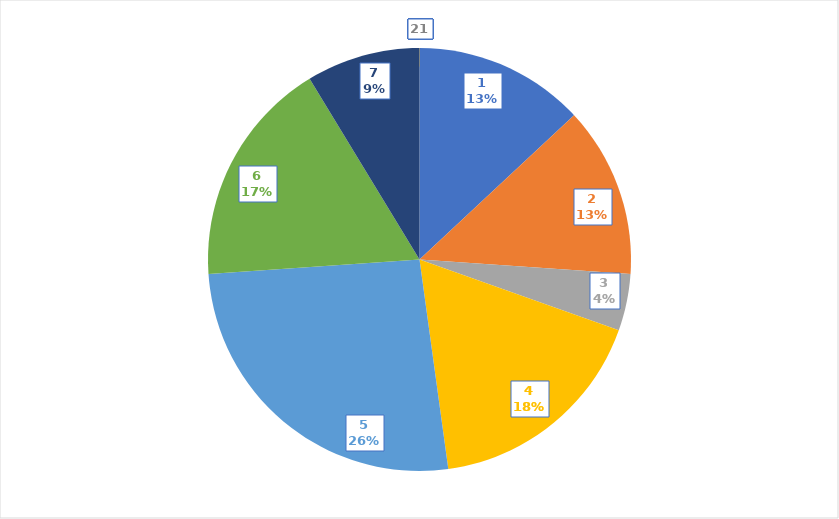
| Category | Количество |
|---|---|
| 1.0 | 3 |
| 2.0 | 3 |
| 3.0 | 1 |
| 4.0 | 4 |
| 5.0 | 6 |
| 6.0 | 4 |
| 7.0 | 2 |
| 8.0 | 0 |
| 9.0 | 0 |
| 10.0 | 0 |
| 11.0 | 0 |
| 12.0 | 0 |
| 13.0 | 0 |
| 14.0 | 0 |
| 15.0 | 0 |
| 16.0 | 0 |
| 17.0 | 0 |
| 18.0 | 0 |
| 19.0 | 0 |
| 20.0 | 0 |
| 21.0 | 0 |